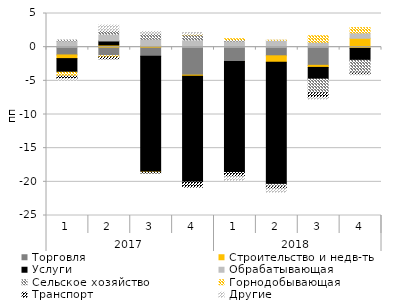
| Category | Торговля | Строительство и недв-ть | Услуги | Обрабатывающая | Сельское хозяйство | Горнодобывающая | Транспорт | Другие |
|---|---|---|---|---|---|---|---|---|
| 0 | -1.155 | -0.545 | -2.022 | 0.94 | 0.104 | -0.583 | -0.364 | -0.23 |
| 1 | -1.25 | 0.325 | 0.595 | 1.015 | 0.552 | -0.222 | -0.254 | 0.794 |
| 2 | -1.359 | 0.229 | -17.197 | 0.953 | 0.883 | -0.071 | -0.051 | 0.283 |
| 3 | -4.152 | -0.182 | -15.707 | 1.076 | 0.758 | 0.08 | -0.742 | 0.248 |
| 4 | -2.136 | -0.01 | -16.464 | 0.915 | 0.17 | 0.168 | -0.613 | -0.553 |
| 5 | -1.283 | -0.944 | -18.147 | 1.02 | -0.334 | 0.005 | -0.296 | -0.538 |
| 6 | -2.7 | -0.306 | -1.736 | 0.739 | -2.048 | 0.956 | -0.703 | -0.22 |
| 7 | -0.196 | 1.321 | -1.754 | 0.805 | -1.877 | 0.769 | -0.221 | -0.053 |